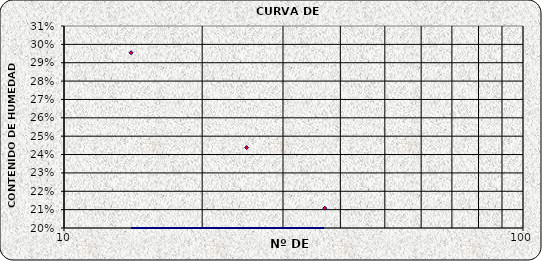
| Category | Series 0 |
|---|---|
| 37.0 | 0.211 |
| 25.0 | 0.244 |
| 14.0 | 0.295 |